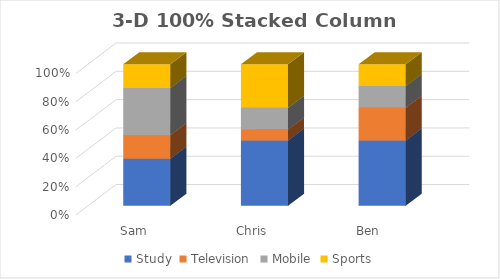
| Category | Study | Television | Mobile | Sports |
|---|---|---|---|---|
| Sam | 2 | 1 | 2 | 1 |
| Chris | 3 | 0.5 | 1 | 2 |
| Ben | 3 | 1.5 | 1 | 1 |